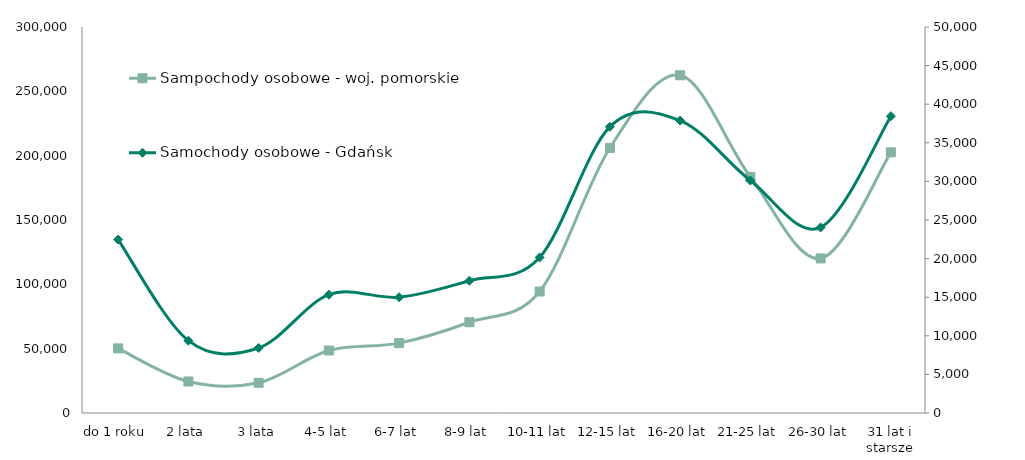
| Category | Sampochody osobowe - woj. pomorskie |
|---|---|
| do 1 roku | 50216 |
| 2 lata | 24476 |
| 3 lata | 23467 |
| 4-5 lat | 48572 |
| 6-7 lat | 54318 |
| 8-9 lat | 70543 |
| 10-11 lat | 94412 |
| 12-15 lat | 205994 |
| 16-20 lat | 262480 |
| 21-25 lat | 183549 |
| 26-30 lat | 120151 |
| 31 lat i starsze | 202609 |